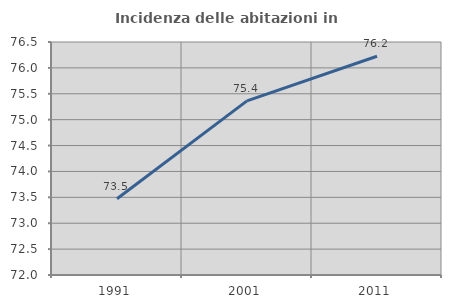
| Category | Incidenza delle abitazioni in proprietà  |
|---|---|
| 1991.0 | 73.474 |
| 2001.0 | 75.364 |
| 2011.0 | 76.225 |